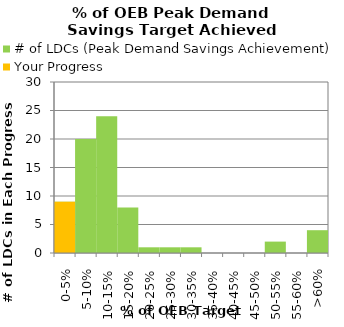
| Category | # of LDCs (Peak Demand Savings Achievement) | Your Progress |
|---|---|---|
| 0-5% | 9 | 9 |
| 5-10% | 20 | 0 |
| 10-15% | 24 | 0 |
| 15-20% | 8 | 0 |
| 20-25% | 1 | 0 |
| 25-30% | 1 | 0 |
| 30-35% | 1 | 0 |
| 35-40% | 0 | 0 |
| 40-45% | 0 | 0 |
| 45-50% | 0 | 0 |
| 50-55% | 2 | 0 |
| 55-60% | 0 | 0 |
| >60% | 4 | 0 |